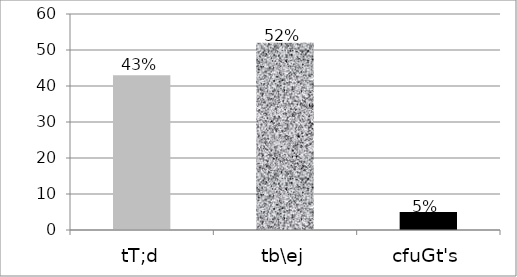
| Category | Series 0 |
|---|---|
| tT;d | 43 |
| tb\ej | 52 |
| cfuGt's | 5 |